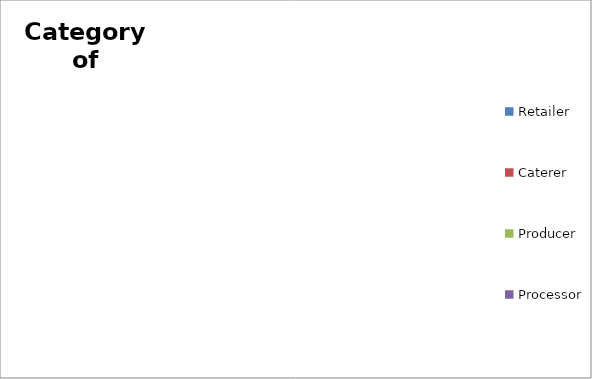
| Category | Series 0 |
|---|---|
| Retailer | 0 |
| Caterer | 0 |
| Producer | 0 |
| Processor | 0 |